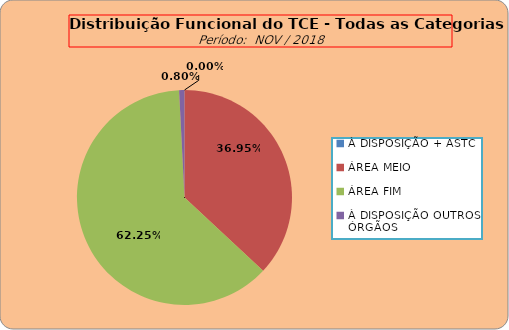
| Category | Series 0 |
|---|---|
| À DISPOSIÇÃO + ASTC | 0 |
| ÁREA MEIO | 184 |
| ÁREA FIM | 310 |
| À DISPOSIÇÃO OUTROS ÓRGÃOS | 4 |